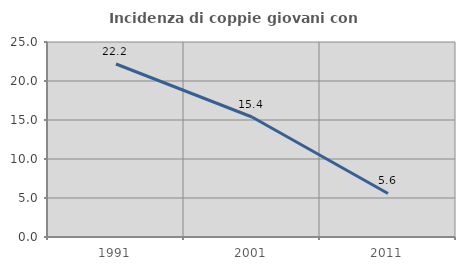
| Category | Incidenza di coppie giovani con figli |
|---|---|
| 1991.0 | 22.182 |
| 2001.0 | 15.385 |
| 2011.0 | 5.584 |